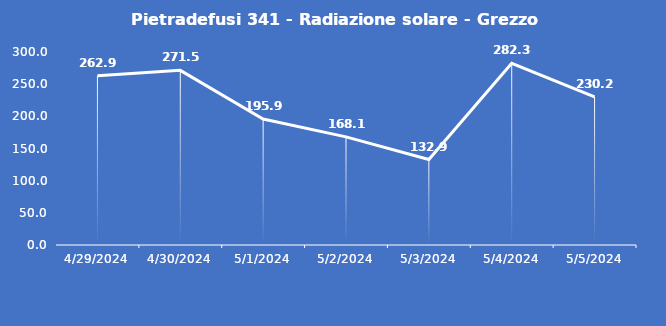
| Category | Pietradefusi 341 - Radiazione solare - Grezzo (W/m2) |
|---|---|
| 4/29/24 | 262.9 |
| 4/30/24 | 271.5 |
| 5/1/24 | 195.9 |
| 5/2/24 | 168.1 |
| 5/3/24 | 132.9 |
| 5/4/24 | 282.3 |
| 5/5/24 | 230.2 |